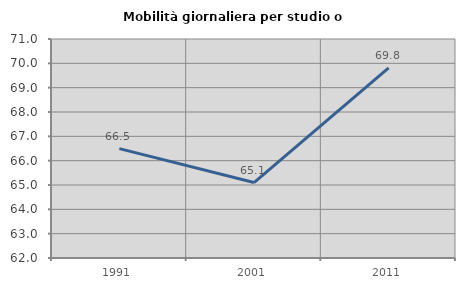
| Category | Mobilità giornaliera per studio o lavoro |
|---|---|
| 1991.0 | 66.494 |
| 2001.0 | 65.101 |
| 2011.0 | 69.817 |